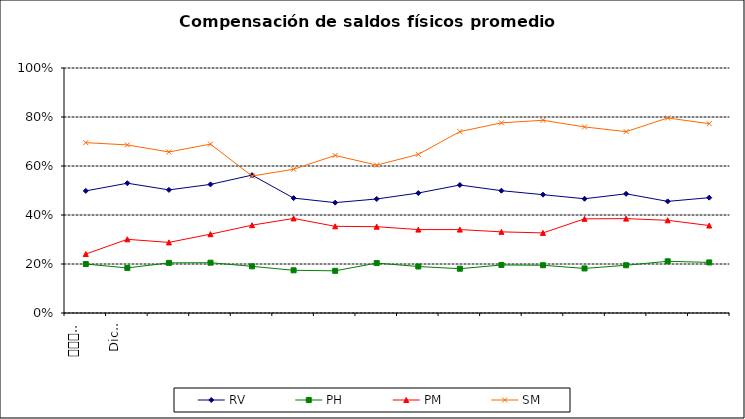
| Category | RV | PH | PM | SM |
|---|---|---|---|---|
| 0 | 0.498 | 0.2 | 0.241 | 0.695 |
| 1 | 0.53 | 0.184 | 0.301 | 0.686 |
| 2 | 0.502 | 0.205 | 0.288 | 0.657 |
| 3 | 0.525 | 0.205 | 0.322 | 0.689 |
| 4 | 0.563 | 0.19 | 0.358 | 0.559 |
| 5 | 0.469 | 0.174 | 0.386 | 0.587 |
| 6 | 0.45 | 0.172 | 0.354 | 0.643 |
| 7 | 0.465 | 0.204 | 0.352 | 0.604 |
| 8 | 0.49 | 0.19 | 0.34 | 0.647 |
| 9 | 0.522 | 0.181 | 0.34 | 0.74 |
| 10 | 0.499 | 0.196 | 0.331 | 0.776 |
| 11 | 0.483 | 0.195 | 0.327 | 0.787 |
| 12 | 0.466 | 0.182 | 0.384 | 0.759 |
| 13 | 0.486 | 0.195 | 0.385 | 0.74 |
| 14 | 0.456 | 0.211 | 0.378 | 0.796 |
| 15 | 0.471 | 0.206 | 0.357 | 0.773 |